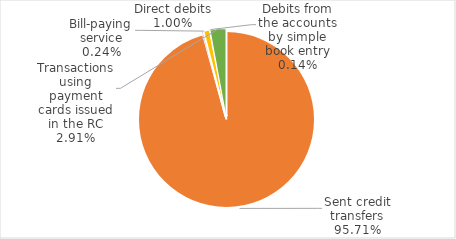
| Category | Total | Series 1 |
|---|---|---|
|  | 0 |  |
| Sent credit transfers | 2181733638720 |  |
| Bill-paying service | 5404906960 |  |
| Direct debits | 22893521426 |  |
| Debits from the accounts by simple book entry | 3117091423 |  |
| Transactions using payment cards issued in the RC | 66339740534 |  |